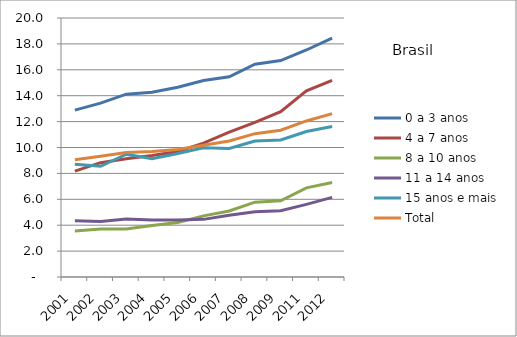
| Category | 0 a 3 anos | 4 a 7 anos | 8 a 10 anos | 11 a 14 anos | 15 anos e mais | Total |
|---|---|---|---|---|---|---|
| 2001.0 | 12.89 | 8.17 | 3.56 | 4.34 | 8.71 | 9.05 |
| 2002.0 | 13.43 | 8.83 | 3.7 | 4.28 | 8.55 | 9.33 |
| 2003.0 | 14.12 | 9.13 | 3.7 | 4.48 | 9.48 | 9.61 |
| 2004.0 | 14.27 | 9.38 | 3.98 | 4.4 | 9.13 | 9.69 |
| 2005.0 | 14.65 | 9.69 | 4.21 | 4.41 | 9.53 | 9.85 |
| 2006.0 | 15.17 | 10.34 | 4.72 | 4.45 | 9.98 | 10.18 |
| 2007.0 | 15.46 | 11.18 | 5.1 | 4.77 | 9.93 | 10.5 |
| 2008.0 | 16.43 | 11.94 | 5.78 | 5.04 | 10.5 | 11.07 |
| 2009.0 | 16.71 | 12.77 | 5.89 | 5.11 | 10.58 | 11.33 |
| 2011.0 | 17.53 | 14.37 | 6.88 | 5.61 | 11.23 | 12.05 |
| 2012.0 | 18.45 | 15.19 | 7.3 | 6.15 | 11.62 | 12.62 |